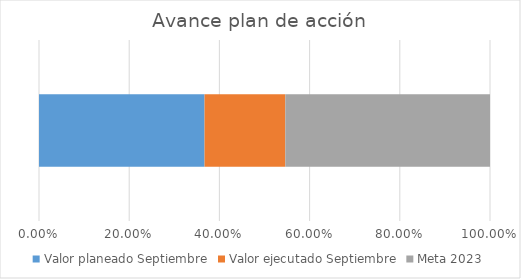
| Category | Valor planeado Septiembre | Valor ejecutado Septiembre | Meta 2023 |
|---|---|---|---|
| 0 | 0.367 | 0.179 | 0.454 |